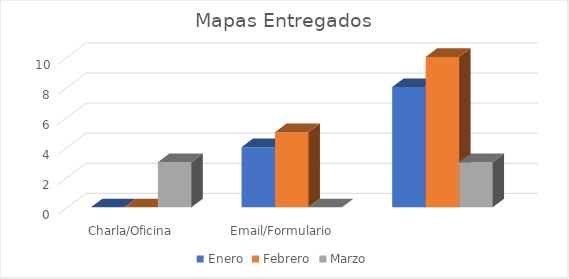
| Category | Enero | Febrero | Marzo |
|---|---|---|---|
| Charla/Oficina | 0 | 0 | 3 |
| Email/Formulario | 4 | 5 | 0 |